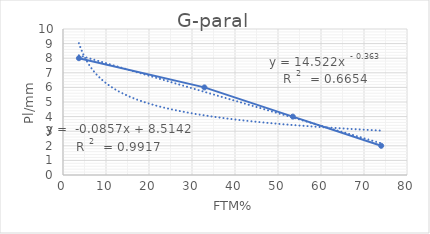
| Category | G-paral |
|---|---|
| 74.0 | 2 |
| 53.44444444444444 | 4 |
| 32.888888888888886 | 6 |
| 3.6999999999999997 | 8 |